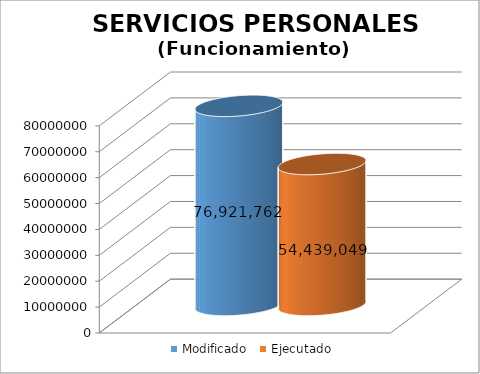
| Category | Modificado | Ejecutado |
|---|---|---|
| 0 | 76921762 | 54439049.3 |